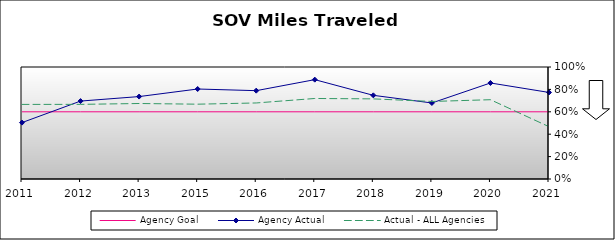
| Category | Agency Goal | Agency Actual | Actual - ALL Agencies |
|---|---|---|---|
| 2011.0 | 0.6 | 0.503 | 0.666 |
| 2012.0 | 0.6 | 0.696 | 0.666 |
| 2013.0 | 0.6 | 0.736 | 0.674 |
| 2015.0 | 0.6 | 0.804 | 0.668 |
| 2016.0 | 0.6 | 0.789 | 0.679 |
| 2017.0 | 0.6 | 0.887 | 0.719 |
| 2018.0 | 0.6 | 0.747 | 0.715 |
| 2019.0 | 0.6 | 0.679 | 0.692 |
| 2020.0 | 0.6 | 0.857 | 0.708 |
| 2021.0 | 0.6 | 0.773 | 0.467 |